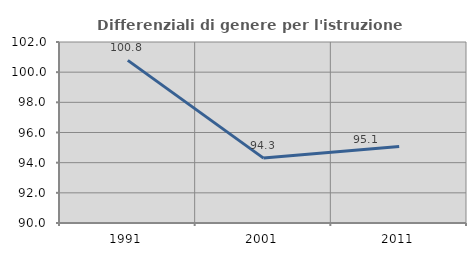
| Category | Differenziali di genere per l'istruzione superiore |
|---|---|
| 1991.0 | 100.783 |
| 2001.0 | 94.302 |
| 2011.0 | 95.069 |